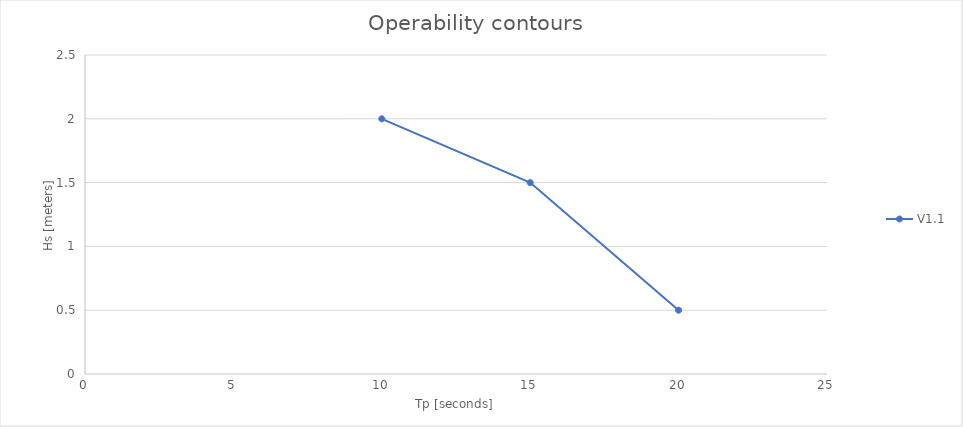
| Category | V1.1 |
|---|---|
| 10.0 | 2 |
| 15.0 | 1.5 |
| 20.0 | 0.5 |